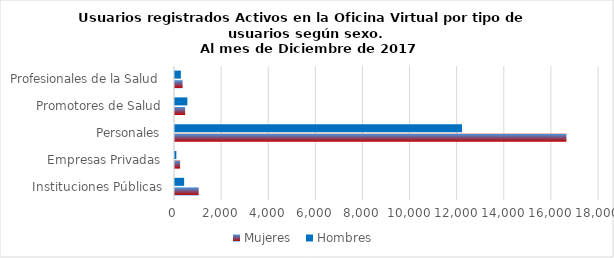
| Category | Mujeres | Hombres |
|---|---|---|
| Instituciones Públicas | 1004 | 388 |
| Empresas Privadas | 216 | 57 |
| Personales | 16618 | 12184 |
| Promotores de Salud | 430 | 525 |
| Profesionales de la Salud | 323 | 249 |